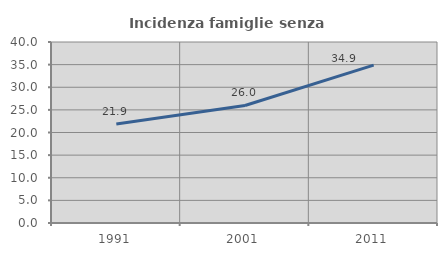
| Category | Incidenza famiglie senza nuclei |
|---|---|
| 1991.0 | 21.895 |
| 2001.0 | 25.979 |
| 2011.0 | 34.904 |